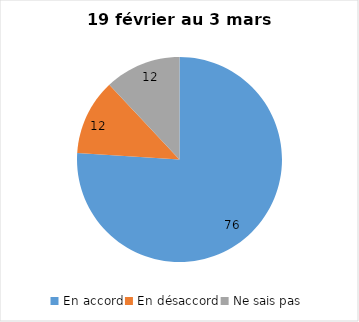
| Category | Series 0 |
|---|---|
| En accord | 76 |
| En désaccord | 12 |
| Ne sais pas | 12 |